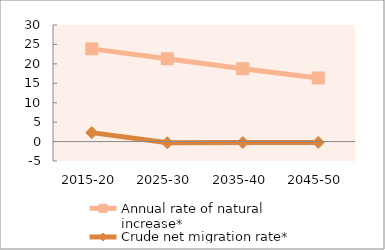
| Category | Annual rate of natural increase* | Crude net migration rate* |
|---|---|---|
| 2015-20 | 23.858 | 2.307 |
| 2025-30 | 21.312 | -0.304 |
| 2035-40 | 18.738 | -0.25 |
| 2045-50 | 16.36 | -0.21 |